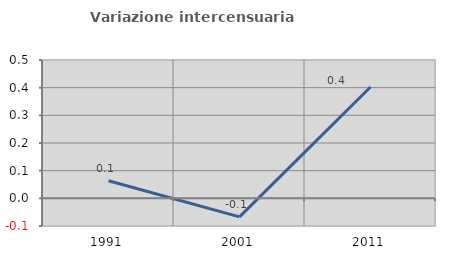
| Category | Variazione intercensuaria annua |
|---|---|
| 1991.0 | 0.064 |
| 2001.0 | -0.067 |
| 2011.0 | 0.402 |